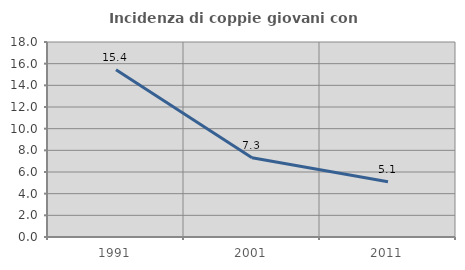
| Category | Incidenza di coppie giovani con figli |
|---|---|
| 1991.0 | 15.44 |
| 2001.0 | 7.32 |
| 2011.0 | 5.101 |